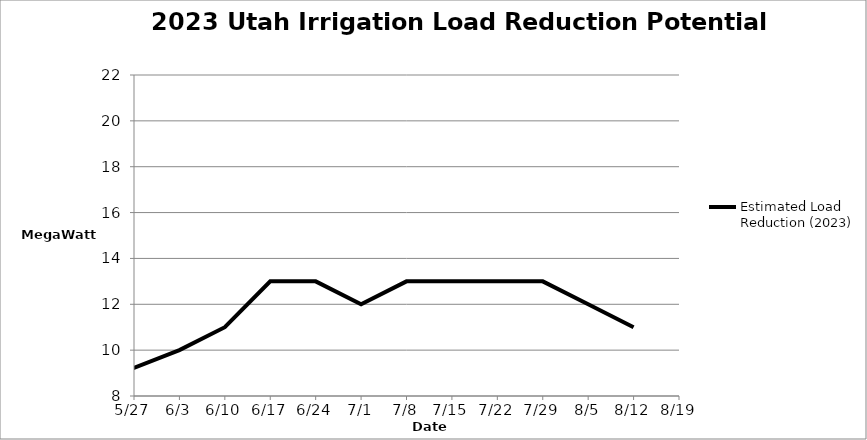
| Category | Estimated Load Reduction (2023) |
|---|---|
| 43245.0 | 9 |
| 43254.0 | 10 |
| 43261.0 | 11 |
| 43268.0 | 13 |
| 43275.0 | 13 |
| 43282.0 | 12 |
| 43289.0 | 13 |
| 43296.0 | 13 |
| 43303.0 | 13 |
| 43310.0 | 13 |
| 43317.0 | 12 |
| 43324.0 | 11 |